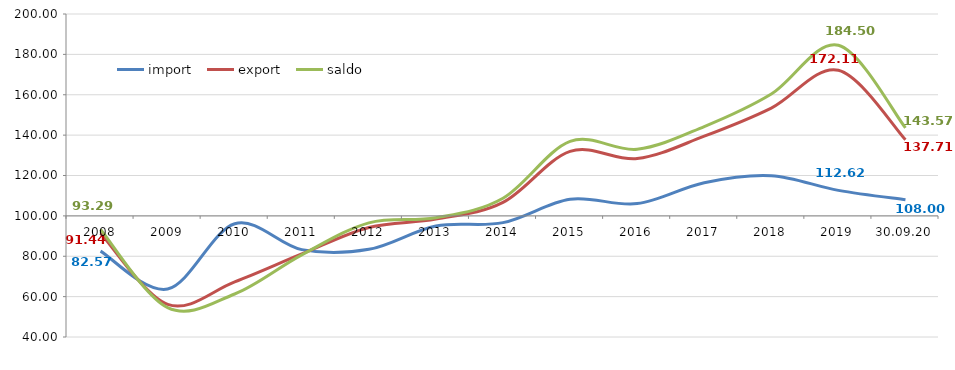
| Category | import | export | saldo |
|---|---|---|---|
| 2008 | 82.565 | 91.438 | 93.286 |
| 2009 | 63.765 | 56.149 | 54.564 |
| 2010 | 96.102 | 67.307 | 61.31 |
| 2011 | 83.293 | 81.147 | 80.7 |
| 2012 | 83.417 | 94.269 | 96.529 |
| 2013 | 94.997 | 98.381 | 99.085 |
| 2014 | 96.657 | 106.665 | 108.75 |
| 2015 | 108.226 | 131.933 | 136.87 |
| 2016 | 106.079 | 128.371 | 133.014 |
| 2017 | 116.45 | 139.462 | 144.255 |
| 2018 | 119.895 | 153.386 | 160.361 |
| 2019 | 112.624 | 172.11 | 184.498 |
| 30.09.20 | 108.004 | 137.714 | 143.575 |